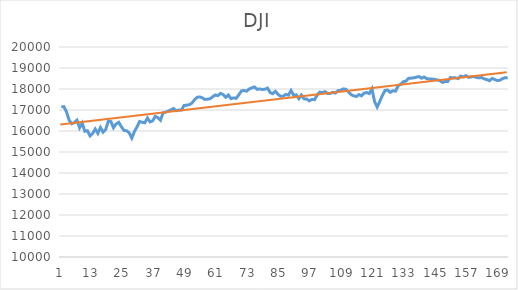
| Category | Adj Close |
|---|---|
| 0 | 17148.939 |
| 1 | 17158.66 |
| 2 | 16906.51 |
| 3 | 16514.1 |
| 4 | 16346.45 |
| 5 | 16398.57 |
| 6 | 16516.221 |
| 7 | 16151.41 |
| 8 | 16379.05 |
| 9 | 15988.08 |
| 10 | 16016.02 |
| 11 | 15766.74 |
| 12 | 15882.68 |
| 13 | 16093.51 |
| 14 | 15885.22 |
| 15 | 16167.23 |
| 16 | 15944.46 |
| 17 | 16069.64 |
| 18 | 16466.301 |
| 19 | 16449.18 |
| 20 | 16153.54 |
| 21 | 16336.66 |
| 22 | 16416.58 |
| 23 | 16204.97 |
| 24 | 16027.05 |
| 25 | 16014.38 |
| 26 | 15914.74 |
| 27 | 15660.18 |
| 28 | 15973.84 |
| 29 | 16196.41 |
| 30 | 16453.83 |
| 31 | 16413.43 |
| 32 | 16391.99 |
| 33 | 16620.66 |
| 34 | 16431.779 |
| 35 | 16484.99 |
| 36 | 16697.289 |
| 37 | 16639.971 |
| 38 | 16516.5 |
| 39 | 16865.08 |
| 40 | 16899.32 |
| 41 | 16943.9 |
| 42 | 17006.77 |
| 43 | 17073.949 |
| 44 | 16964.1 |
| 45 | 17000.359 |
| 46 | 16995.131 |
| 47 | 17213.311 |
| 48 | 17229.131 |
| 49 | 17251.529 |
| 50 | 17325.76 |
| 51 | 17481.49 |
| 52 | 17602.301 |
| 53 | 17623.869 |
| 54 | 17582.57 |
| 55 | 17502.59 |
| 56 | 17515.73 |
| 57 | 17535.391 |
| 58 | 17633.109 |
| 59 | 17716.66 |
| 60 | 17685.09 |
| 61 | 17792.75 |
| 62 | 17737 |
| 63 | 17603.32 |
| 64 | 17716.051 |
| 65 | 17541.961 |
| 66 | 17576.961 |
| 67 | 17556.41 |
| 68 | 17721.25 |
| 69 | 17908.279 |
| 70 | 17926.43 |
| 71 | 17897.461 |
| 72 | 18004.16 |
| 73 | 18053.6 |
| 74 | 18096.27 |
| 75 | 17982.52 |
| 76 | 18003.75 |
| 77 | 17977.24 |
| 78 | 17990.32 |
| 79 | 18041.551 |
| 80 | 17830.76 |
| 81 | 17773.641 |
| 82 | 17891.16 |
| 83 | 17750.91 |
| 84 | 17651.26 |
| 85 | 17660.711 |
| 86 | 17740.631 |
| 87 | 17705.91 |
| 88 | 17928.35 |
| 89 | 17711.119 |
| 90 | 17720.5 |
| 91 | 17535.32 |
| 92 | 17710.711 |
| 93 | 17529.98 |
| 94 | 17526.619 |
| 95 | 17435.4 |
| 96 | 17500.939 |
| 97 | 17492.93 |
| 98 | 17706.051 |
| 99 | 17851.51 |
| 100 | 17828.289 |
| 101 | 17873.221 |
| 102 | 17787.199 |
| 103 | 17789.67 |
| 104 | 17838.561 |
| 105 | 17807.061 |
| 106 | 17920.33 |
| 107 | 17938.279 |
| 108 | 18005.051 |
| 109 | 17985.189 |
| 110 | 17865.34 |
| 111 | 17732.48 |
| 112 | 17674.82 |
| 113 | 17640.17 |
| 114 | 17733.1 |
| 115 | 17675.16 |
| 116 | 17804.869 |
| 117 | 17829.73 |
| 118 | 17780.83 |
| 119 | 18011.07 |
| 120 | 17400.75 |
| 121 | 17140.24 |
| 122 | 17409.721 |
| 123 | 17694.68 |
| 124 | 17929.99 |
| 125 | 17949.369 |
| 126 | 17840.619 |
| 127 | 17918.619 |
| 128 | 17895.881 |
| 129 | 18146.74 |
| 130 | 18226.93 |
| 131 | 18347.67 |
| 132 | 18372.119 |
| 133 | 18506.41 |
| 134 | 18516.551 |
| 135 | 18533.051 |
| 136 | 18559.01 |
| 137 | 18595.029 |
| 138 | 18517.23 |
| 139 | 18570.85 |
| 140 | 18493.061 |
| 141 | 18473.75 |
| 142 | 18472.17 |
| 143 | 18456.35 |
| 144 | 18432.24 |
| 145 | 18404.51 |
| 146 | 18313.77 |
| 147 | 18355 |
| 148 | 18352.051 |
| 149 | 18543.529 |
| 150 | 18529.289 |
| 151 | 18533.051 |
| 152 | 18495.66 |
| 153 | 18613.52 |
| 154 | 18576.471 |
| 155 | 18636.051 |
| 156 | 18552.02 |
| 157 | 18573.939 |
| 158 | 18597.699 |
| 159 | 18552.57 |
| 160 | 18529.42 |
| 161 | 18547.301 |
| 162 | 18481.48 |
| 163 | 18448.41 |
| 164 | 18395.4 |
| 165 | 18502.99 |
| 166 | 18454.301 |
| 167 | 18400.881 |
| 168 | 18419.301 |
| 169 | 18491.961 |
| 170 | 18538.119 |
| 171 | 18526.141 |